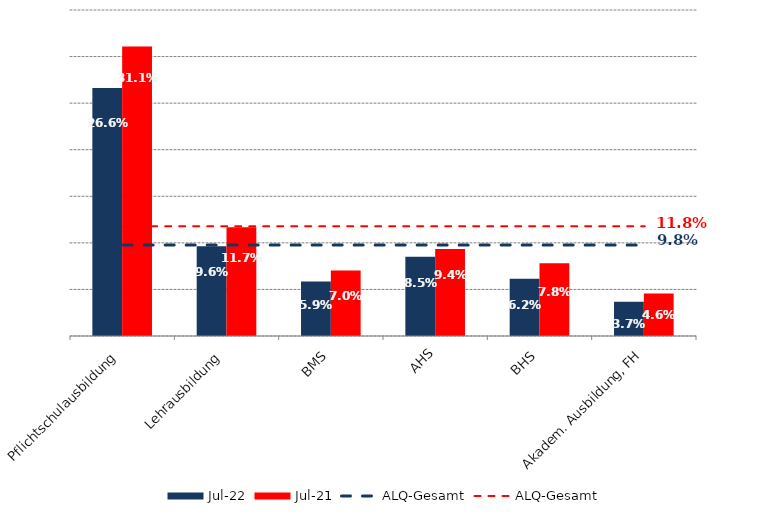
| Category | Jul 22 | Jul 21 |
|---|---|---|
| Pflichtschulausbildung | 0.266 | 0.311 |
| Lehrausbildung | 0.096 | 0.117 |
| BMS | 0.059 | 0.07 |
| AHS | 0.085 | 0.094 |
| BHS | 0.062 | 0.078 |
| Akadem. Ausbildung, FH | 0.037 | 0.046 |